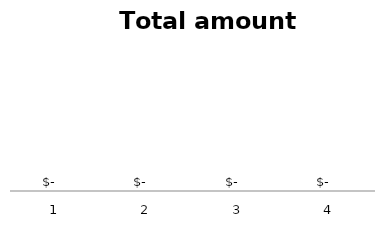
| Category | Total amount Paid |
|---|---|
| 0 | 0 |
| 1 | 0 |
| 2 | 0 |
| 3 | 0 |